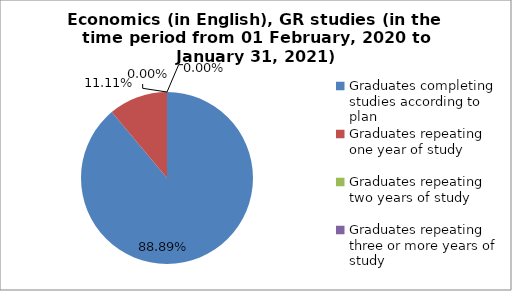
| Category | Series 0 |
|---|---|
| Graduates completing studies according to plan | 88.889 |
| Graduates repeating one year of study | 11.111 |
| Graduates repeating two years of study | 0 |
| Graduates repeating three or more years of study | 0 |